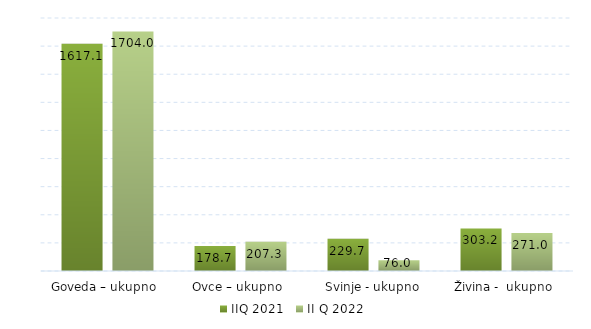
| Category | IIQ 2021 | II Q 2022 |
|---|---|---|
| Goveda – ukupno  | 1617.1 | 1704 |
| Ovce – ukupno  | 178.7 | 207.3 |
| Svinje - ukupno | 229.7 | 76 |
| Živina -  ukupno  | 303.2 | 271 |